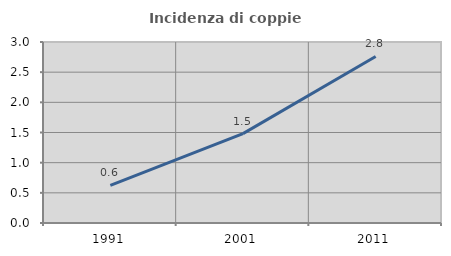
| Category | Incidenza di coppie miste |
|---|---|
| 1991.0 | 0.622 |
| 2001.0 | 1.481 |
| 2011.0 | 2.761 |